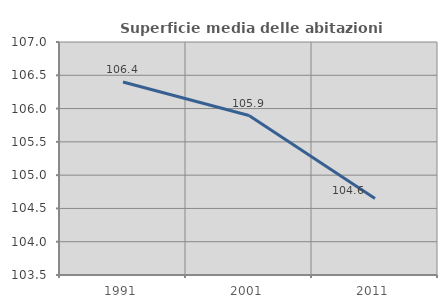
| Category | Superficie media delle abitazioni occupate |
|---|---|
| 1991.0 | 106.4 |
| 2001.0 | 105.895 |
| 2011.0 | 104.648 |